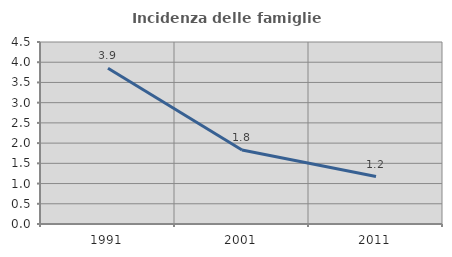
| Category | Incidenza delle famiglie numerose |
|---|---|
| 1991.0 | 3.852 |
| 2001.0 | 1.83 |
| 2011.0 | 1.174 |